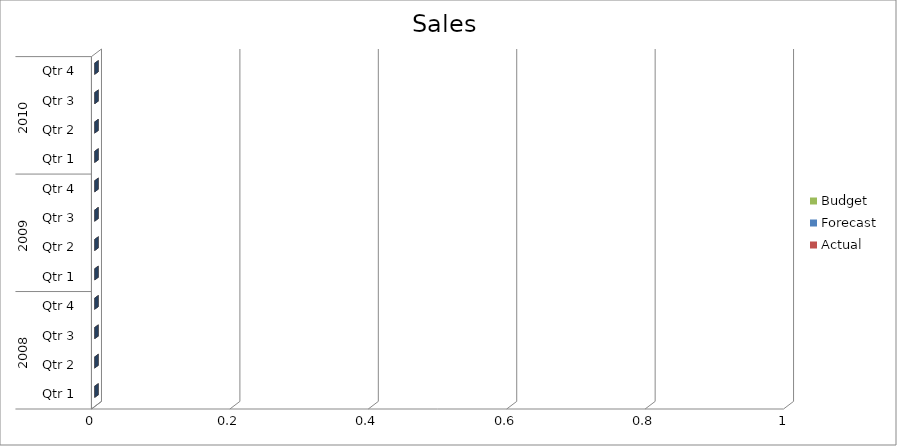
| Category | Budget | Forecast | Actual |
|---|---|---|---|
| 0 | 2520 | 810 | 880 |
| 1 | 740 | 2500 | 1090 |
| 2 | 3030 | 3230 | 3030 |
| 3 | 1060 | 530 | 900 |
| 4 | 1900 | 3270 | 2640 |
| 5 | 1740 | 1180 | 1210 |
| 6 | 500 | 1170 | 2500 |
| 7 | 2600 | 610 | 2350 |
| 8 | 1530 | 3070 | 3240 |
| 9 | 1650 | 1650 | 2840 |
| 10 | 2840 | 3430 | 800 |
| 11 | 3320 | 950 | 1130 |